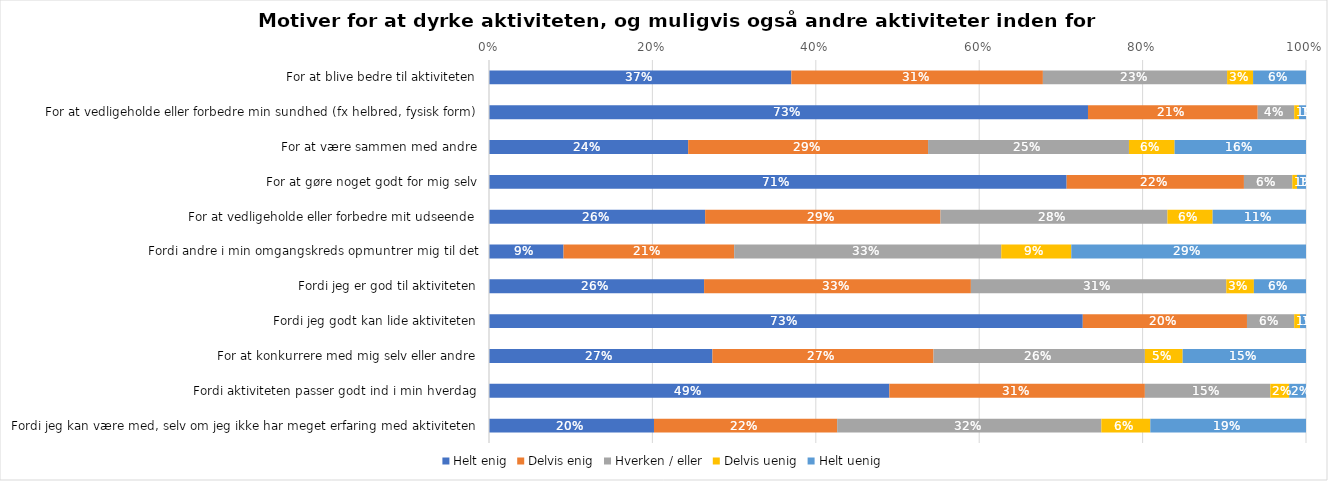
| Category | Helt enig | Delvis enig | Hverken / eller | Delvis uenig | Helt uenig |
|---|---|---|---|---|---|
| For at blive bedre til aktiviteten | 0.37 | 0.308 | 0.225 | 0.032 | 0.065 |
| For at vedligeholde eller forbedre min sundhed (fx helbred, fysisk form) | 0.733 | 0.208 | 0.045 | 0.006 | 0.009 |
| For at være sammen med andre | 0.244 | 0.294 | 0.246 | 0.056 | 0.161 |
| For at gøre noget godt for mig selv | 0.707 | 0.217 | 0.059 | 0.006 | 0.011 |
| For at vedligeholde eller forbedre mit udseende | 0.265 | 0.288 | 0.278 | 0.055 | 0.114 |
| Fordi andre i min omgangskreds opmuntrer mig til det | 0.091 | 0.209 | 0.327 | 0.086 | 0.287 |
| Fordi jeg er god til aktiviteten | 0.263 | 0.327 | 0.313 | 0.034 | 0.064 |
| Fordi jeg godt kan lide aktiviteten | 0.727 | 0.201 | 0.058 | 0.007 | 0.007 |
| For at konkurrere med mig selv eller andre | 0.273 | 0.271 | 0.259 | 0.046 | 0.151 |
| Fordi aktiviteten passer godt ind i min hverdag | 0.49 | 0.313 | 0.154 | 0.023 | 0.021 |
| Fordi jeg kan være med, selv om jeg ikke har meget erfaring med aktiviteten | 0.202 | 0.224 | 0.323 | 0.06 | 0.191 |